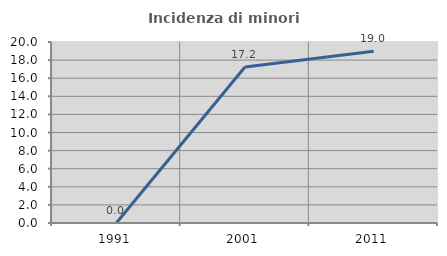
| Category | Incidenza di minori stranieri |
|---|---|
| 1991.0 | 0 |
| 2001.0 | 17.241 |
| 2011.0 | 18.987 |